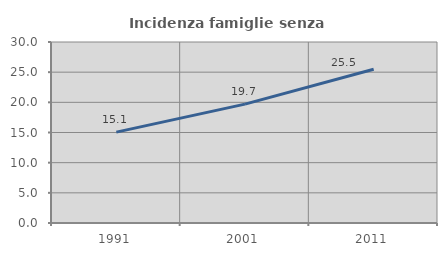
| Category | Incidenza famiglie senza nuclei |
|---|---|
| 1991.0 | 15.061 |
| 2001.0 | 19.7 |
| 2011.0 | 25.482 |